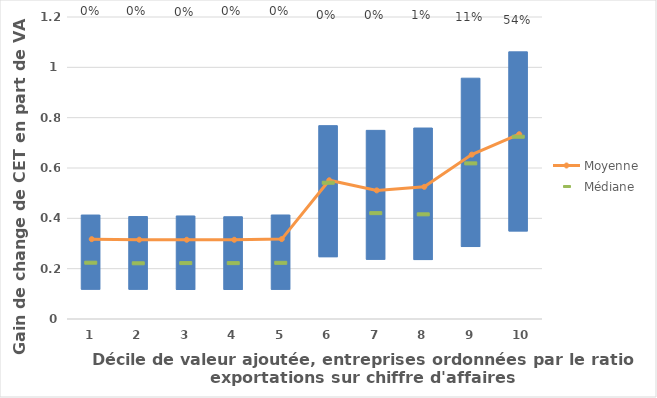
| Category | lower | upper |
|---|---|---|
| 1.0 | 0.117 | 0.296 |
| 2.0 | 0.116 | 0.291 |
| 3.0 | 0.116 | 0.294 |
| 4.0 | 0.116 | 0.291 |
| 5.0 | 0.116 | 0.297 |
| 6.0 | 0.246 | 0.523 |
| 7.0 | 0.235 | 0.514 |
| 8.0 | 0.234 | 0.525 |
| 9.0 | 0.286 | 0.671 |
| 10.0 | 0.348 | 0.713 |